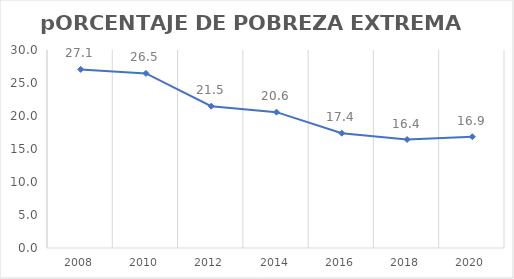
| Category | Series 0 |
|---|---|
| 2008.0 | 27.064 |
| 2010.0 | 26.454 |
| 2012.0 | 21.491 |
| 2014.0 | 20.582 |
| 2016.0 | 17.395 |
| 2018.0 | 16.437 |
| 2020.0 | 16.855 |